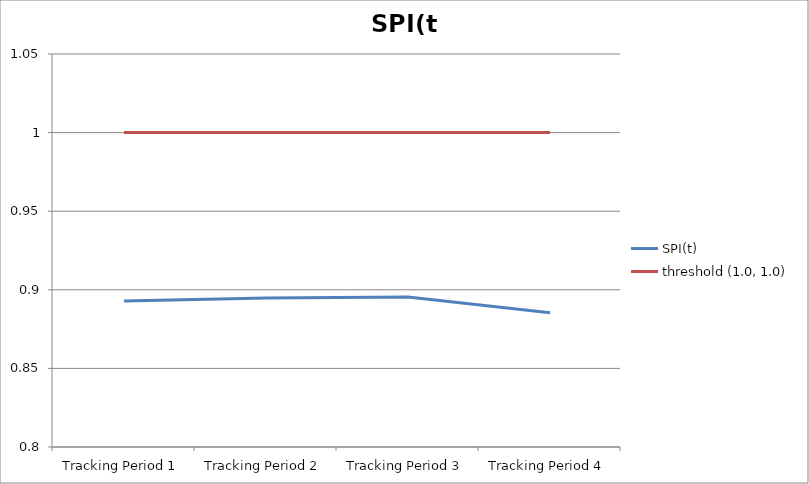
| Category | SPI(t) | threshold (1.0, 1.0) |
|---|---|---|
| Tracking Period 1 | 0.893 | 1 |
| Tracking Period 2 | 0.895 | 1 |
| Tracking Period 3 | 0.895 | 1 |
| Tracking Period 4 | 0.885 | 1 |